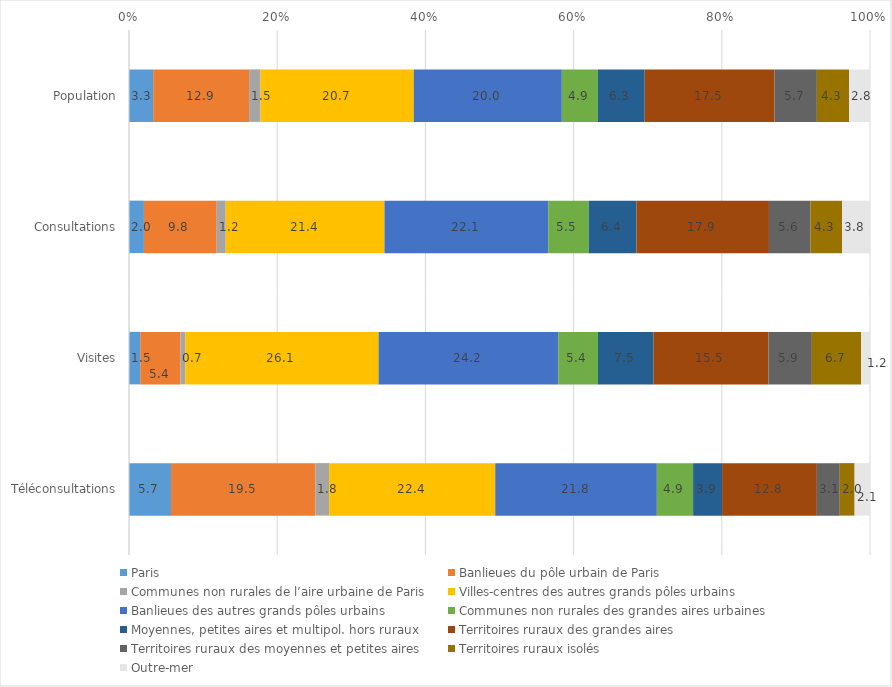
| Category | Paris | Banlieues du pôle urbain de Paris | Communes non rurales de l’aire urbaine de Paris | Villes-centres des autres grands pôles urbains | Banlieues des autres grands pôles urbains | Communes non rurales des grandes aires urbaines | Moyennes, petites aires et multipol. hors ruraux | Territoires ruraux des grandes aires | Territoires ruraux des moyennes et petites aires | Territoires ruraux isolés | Outre-mer |
|---|---|---|---|---|---|---|---|---|---|---|---|
| Population | 3.26 | 12.949 | 1.531 | 20.685 | 19.987 | 4.869 | 6.311 | 17.53 | 5.708 | 4.34 | 2.83 |
| Consultations | 2.014 | 9.827 | 1.21 | 21.42 | 22.104 | 5.47 | 6.441 | 17.878 | 5.604 | 4.261 | 3.771 |
| Visites | 1.516 | 5.419 | 0.655 | 26.088 | 24.245 | 5.369 | 7.477 | 15.538 | 5.851 | 6.656 | 1.186 |
| Téléconsultations | 5.666 | 19.497 | 1.85 | 22.411 | 21.811 | 4.893 | 3.908 | 12.795 | 3.09 | 2.006 | 2.074 |